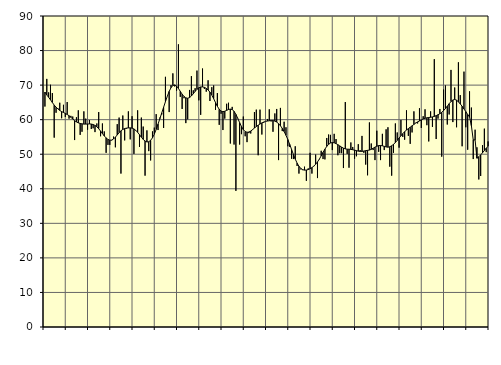
| Category | Piggar | Series 1 |
|---|---|---|
| nan | 63.8 | 67.99 |
| 1.0 | 71.8 | 67.13 |
| 1.0 | 67.9 | 66.48 |
| 1.0 | 70.1 | 65.73 |
| 1.0 | 67.7 | 64.97 |
| 1.0 | 54.8 | 64.22 |
| 1.0 | 62 | 63.62 |
| 1.0 | 63.3 | 63.11 |
| 1.0 | 64.9 | 62.67 |
| 1.0 | 60.4 | 62.34 |
| 1.0 | 64.3 | 62.07 |
| 1.0 | 60.8 | 61.8 |
| nan | 65.1 | 61.5 |
| 2.0 | 60.3 | 61.14 |
| 2.0 | 61.1 | 60.68 |
| 2.0 | 60.9 | 60.19 |
| 2.0 | 54.1 | 59.72 |
| 2.0 | 60.7 | 59.34 |
| 2.0 | 62.7 | 59.08 |
| 2.0 | 55.6 | 58.91 |
| 2.0 | 56.5 | 58.79 |
| 2.0 | 62.4 | 58.72 |
| 2.0 | 60.3 | 58.72 |
| 2.0 | 57.1 | 58.74 |
| nan | 59.9 | 58.77 |
| 3.0 | 57.3 | 58.73 |
| 3.0 | 57.5 | 58.59 |
| 3.0 | 56.4 | 58.34 |
| 3.0 | 58.9 | 57.94 |
| 3.0 | 62.2 | 57.38 |
| 3.0 | 55.2 | 56.71 |
| 3.0 | 58.9 | 55.97 |
| 3.0 | 56.6 | 55.29 |
| 3.0 | 50.4 | 54.72 |
| 3.0 | 52.7 | 54.28 |
| 3.0 | 52.7 | 54.07 |
| nan | 54 | 54.1 |
| 4.0 | 55.1 | 54.4 |
| 4.0 | 52 | 54.94 |
| 4.0 | 58.7 | 55.58 |
| 4.0 | 60.6 | 56.24 |
| 4.0 | 44.4 | 56.79 |
| 4.0 | 61.2 | 57.17 |
| 4.0 | 54 | 57.43 |
| 4.0 | 57.4 | 57.56 |
| 4.0 | 62.4 | 57.62 |
| 4.0 | 54.3 | 57.63 |
| 4.0 | 61 | 57.55 |
| nan | 50.1 | 57.32 |
| 5.0 | 57 | 56.91 |
| 5.0 | 62.7 | 56.34 |
| 5.0 | 52.1 | 55.66 |
| 5.0 | 60.6 | 54.92 |
| 5.0 | 58 | 54.29 |
| 5.0 | 43.8 | 53.81 |
| 5.0 | 56.9 | 53.55 |
| 5.0 | 50.9 | 53.61 |
| 5.0 | 48.2 | 54.02 |
| 5.0 | 56.6 | 54.75 |
| 5.0 | 57.7 | 55.82 |
| nan | 61.6 | 57.18 |
| 6.0 | 57 | 58.71 |
| 6.0 | 60.6 | 60.3 |
| 6.0 | 61.5 | 61.94 |
| 6.0 | 57.6 | 63.59 |
| 6.0 | 72.4 | 65.21 |
| 6.0 | 66.8 | 66.77 |
| 6.0 | 62.2 | 68.19 |
| 6.0 | 70 | 69.25 |
| 6.0 | 73.4 | 69.89 |
| 6.0 | 69.6 | 70.05 |
| 6.0 | 68.4 | 69.72 |
| nan | 81.8 | 69.03 |
| 7.0 | 66.6 | 68.2 |
| 7.0 | 63.1 | 67.39 |
| 7.0 | 66.2 | 66.72 |
| 7.0 | 59 | 66.31 |
| 7.0 | 60.1 | 66.2 |
| 7.0 | 68.6 | 66.39 |
| 7.0 | 72.6 | 66.85 |
| 7.0 | 68.5 | 67.49 |
| 7.0 | 69.1 | 68.18 |
| 7.0 | 74.2 | 68.78 |
| 7.0 | 65.6 | 69.23 |
| nan | 61.4 | 69.47 |
| 8.0 | 74.8 | 69.48 |
| 8.0 | 68.9 | 69.36 |
| 8.0 | 68.1 | 69.07 |
| 8.0 | 71.4 | 68.6 |
| 8.0 | 65.4 | 67.96 |
| 8.0 | 69.4 | 67.12 |
| 8.0 | 69.9 | 66.09 |
| 8.0 | 62.8 | 64.95 |
| 8.0 | 67.7 | 63.87 |
| 8.0 | 58.5 | 63.02 |
| 8.0 | 61.7 | 62.5 |
| nan | 57 | 62.33 |
| 9.0 | 60.3 | 62.44 |
| 9.0 | 64.6 | 62.68 |
| 9.0 | 64.9 | 62.94 |
| 9.0 | 53.1 | 63.06 |
| 9.0 | 63.7 | 62.92 |
| 9.0 | 52.8 | 62.42 |
| 9.0 | 39.4 | 61.53 |
| 9.0 | 60.5 | 60.39 |
| 9.0 | 52.8 | 59.16 |
| 9.0 | 55.8 | 58.02 |
| 9.0 | 60.9 | 57.12 |
| nan | 55.2 | 56.56 |
| 10.0 | 53.5 | 56.35 |
| 10.0 | 56.1 | 56.43 |
| 10.0 | 56 | 56.7 |
| 10.0 | 57.2 | 57.12 |
| 10.0 | 62.2 | 57.58 |
| 10.0 | 62.9 | 58.01 |
| 10.0 | 49.7 | 58.4 |
| 10.0 | 62.9 | 58.74 |
| 10.0 | 55.7 | 59.06 |
| 10.0 | 59.1 | 59.32 |
| 10.0 | 59.5 | 59.5 |
| nan | 60.2 | 59.6 |
| 11.0 | 63 | 59.68 |
| 11.0 | 59.5 | 59.73 |
| 11.0 | 56.5 | 59.72 |
| 11.0 | 61.8 | 59.59 |
| 11.0 | 63.1 | 59.31 |
| 11.0 | 48.3 | 58.85 |
| 11.0 | 63.4 | 58.24 |
| 11.0 | 56.7 | 57.49 |
| 11.0 | 59.4 | 56.56 |
| 11.0 | 57.8 | 55.48 |
| 11.0 | 52.3 | 54.25 |
| nan | 52.1 | 52.87 |
| 12.0 | 48.7 | 51.41 |
| 12.0 | 48.6 | 49.95 |
| 12.0 | 52.3 | 48.59 |
| 12.0 | 46.6 | 47.43 |
| 12.0 | 44.4 | 46.52 |
| 12.0 | 45.6 | 45.88 |
| 12.0 | 45.4 | 45.53 |
| 12.0 | 46.4 | 45.4 |
| 12.0 | 42.3 | 45.43 |
| 12.0 | 45.9 | 45.56 |
| 12.0 | 50.4 | 45.79 |
| nan | 44.4 | 46.12 |
| 13.0 | 46.5 | 46.55 |
| 13.0 | 49.9 | 47.1 |
| 13.0 | 43.1 | 47.78 |
| 13.0 | 48.5 | 48.59 |
| 13.0 | 51 | 49.52 |
| 13.0 | 48.6 | 50.54 |
| 13.0 | 48.5 | 51.48 |
| 13.0 | 54.7 | 52.26 |
| 13.0 | 55.7 | 52.86 |
| 13.0 | 55.6 | 53.24 |
| 13.0 | 51.2 | 53.38 |
| nan | 55.9 | 53.3 |
| 14.0 | 54.4 | 53.08 |
| 14.0 | 49.7 | 52.76 |
| 14.0 | 50.3 | 52.41 |
| 14.0 | 50.3 | 52.06 |
| 14.0 | 46 | 51.75 |
| 14.0 | 65.1 | 51.54 |
| 14.0 | 50.1 | 51.47 |
| 14.0 | 46.1 | 51.45 |
| 14.0 | 53.4 | 51.4 |
| 14.0 | 52.1 | 51.3 |
| 14.0 | 48.7 | 51.18 |
| nan | 49.4 | 51.04 |
| 15.0 | 52.9 | 50.89 |
| 15.0 | 51.2 | 50.82 |
| 15.0 | 55.3 | 50.83 |
| 15.0 | 50.4 | 50.92 |
| 15.0 | 47 | 51.03 |
| 15.0 | 43.9 | 51.12 |
| 15.0 | 59.2 | 51.2 |
| 15.0 | 53.1 | 51.41 |
| 15.0 | 51.2 | 51.73 |
| 15.0 | 48.3 | 52.05 |
| 15.0 | 56.8 | 52.32 |
| nan | 50.7 | 52.5 |
| 16.0 | 48.3 | 52.53 |
| 16.0 | 55.9 | 52.43 |
| 16.0 | 51.2 | 52.28 |
| 16.0 | 57.2 | 52.11 |
| 16.0 | 57.8 | 52.04 |
| 16.0 | 46.4 | 52.16 |
| 16.0 | 43.8 | 52.45 |
| 16.0 | 50.4 | 52.86 |
| 16.0 | 58.9 | 53.38 |
| 16.0 | 56.3 | 54.01 |
| 16.0 | 51.9 | 54.67 |
| nan | 59.9 | 55.33 |
| 17.0 | 55 | 55.96 |
| 17.0 | 54.2 | 56.53 |
| 17.0 | 62.7 | 57 |
| 17.0 | 55.3 | 57.42 |
| 17.0 | 53 | 57.81 |
| 17.0 | 56.3 | 58.22 |
| 17.0 | 62.4 | 58.62 |
| 17.0 | 59.1 | 59.01 |
| 17.0 | 58.9 | 59.35 |
| 17.0 | 63.3 | 59.63 |
| 17.0 | 57.6 | 59.93 |
| nan | 61 | 60.22 |
| 18.0 | 63 | 60.4 |
| 18.0 | 58.4 | 60.54 |
| 18.0 | 53.7 | 60.64 |
| 18.0 | 62.4 | 60.69 |
| 18.0 | 57.9 | 60.79 |
| 18.0 | 77.5 | 60.94 |
| 18.0 | 54.4 | 61.16 |
| 18.0 | 60.3 | 61.42 |
| 18.0 | 63.1 | 61.72 |
| 18.0 | 49.3 | 62.13 |
| 18.0 | 68.7 | 62.62 |
| nan | 69.9 | 63.21 |
| 19.0 | 58.6 | 63.9 |
| 19.0 | 61.5 | 64.61 |
| 19.0 | 74.4 | 65.24 |
| 19.0 | 59.3 | 65.69 |
| 19.0 | 69.3 | 65.84 |
| 19.0 | 57.8 | 65.65 |
| 19.0 | 76.6 | 65.16 |
| 19.0 | 67.1 | 64.56 |
| 19.0 | 52.3 | 63.87 |
| 19.0 | 73.9 | 63.1 |
| 19.0 | 57.8 | 62.31 |
| nan | 51.3 | 61.5 |
| 20.0 | 68.2 | 60.78 |
| 20.0 | 63.5 | 58.25 |
| 20.0 | 48.6 | 54.17 |
| 20.0 | 57.1 | 54.12 |
| 20.0 | 52 | 48.83 |
| 20.0 | 42.7 | 49.25 |
| 20.0 | 43.7 | 49.81 |
| 20.0 | 52.6 | 50.41 |
| 20.0 | 57.4 | 51.07 |
| 20.0 | 50.6 | 51.74 |
| 20.0 | 53.7 | 52.31 |